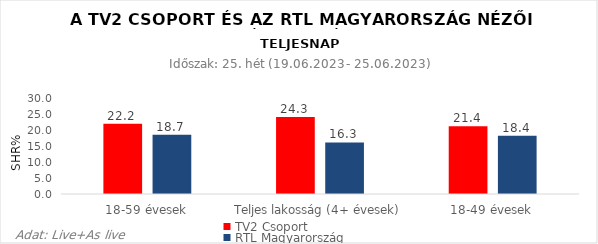
| Category | TV2 Csoport | RTL Magyarország |
|---|---|---|
| 18-59 évesek | 22.2 | 18.7 |
| Teljes lakosság (4+ évesek) | 24.3 | 16.3 |
| 18-49 évesek | 21.4 | 18.4 |